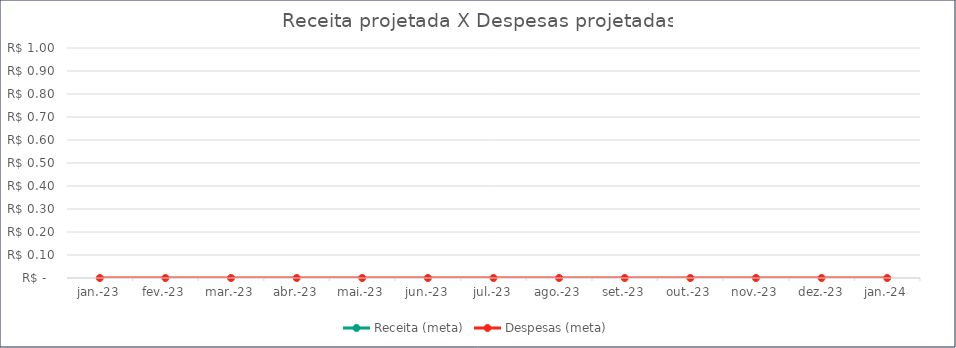
| Category | Receita (meta) | Despesas (meta) |
|---|---|---|
| 2023-01-01 |  | 0 |
| 2023-02-01 |  | 0 |
| 2023-03-01 |  | 0 |
| 2023-04-01 |  | 0 |
| 2023-05-01 |  | 0 |
| 2023-06-01 |  | 0 |
| 2023-07-01 |  | 0 |
| 2023-08-01 |  | 0 |
| 2023-09-01 |  | 0 |
| 2023-10-01 |  | 0 |
| 2023-11-01 |  | 0 |
| 2023-12-01 |  | 0 |
| 2024-01-01 |  | 0 |